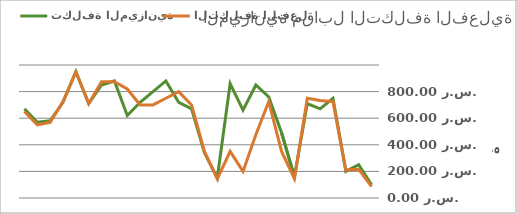
| Category | تكلفة الميزانية | التكلفة الفعلية |
|---|---|---|
| 0 | 100 | 85 |
| 1 | 250 | 215 |
| 2 | 200 | 210 |
| 3 | 750 | 724 |
| 4 | 670 | 733 |
| 5 | 710 | 750 |
| 6 | 160 | 145 |
| 7 | 490 | 350 |
| 8 | 760 | 725 |
| 9 | 850 | 475 |
| 10 | 660 | 200 |
| 11 | 860 | 350 |
| 12 | 150 | 144 |
| 13 | 340 | 350 |
| 14 | 670 | 700 |
| 15 | 720 | 800 |
| 16 | 880 | 750 |
| 17 | 800 | 700 |
| 18 | 720 | 700 |
| 19 | 620 | 820 |
| 20 | 880 | 875 |
| 21 | 850 | 875 |
| 22 | 710 | 710 |
| 23 | 950 | 949 |
| 24 | 720 | 725 |
| 25 | 580 | 569 |
| 26 | 570 | 550 |
| 27 | 670 | 650 |